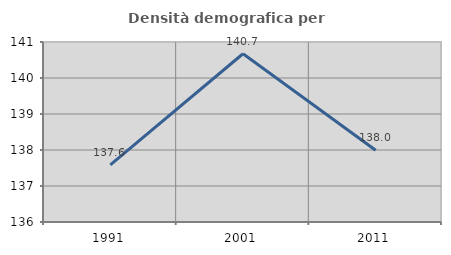
| Category | Densità demografica |
|---|---|
| 1991.0 | 137.585 |
| 2001.0 | 140.673 |
| 2011.0 | 137.994 |